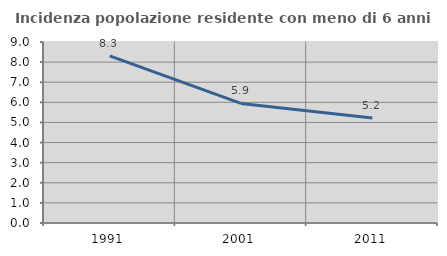
| Category | Incidenza popolazione residente con meno di 6 anni |
|---|---|
| 1991.0 | 8.309 |
| 2001.0 | 5.944 |
| 2011.0 | 5.216 |